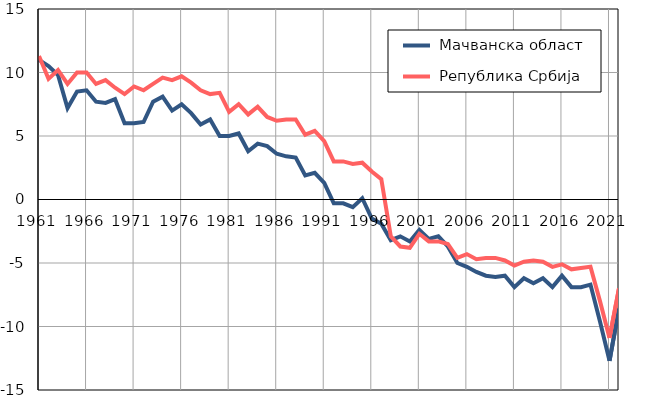
| Category |  Мачванска област |  Република Србија |
|---|---|---|
| 1961.0 | 11 | 11.3 |
| 1962.0 | 10.5 | 9.5 |
| 1963.0 | 9.8 | 10.2 |
| 1964.0 | 7.2 | 9.1 |
| 1965.0 | 8.5 | 10 |
| 1966.0 | 8.6 | 10 |
| 1967.0 | 7.7 | 9.1 |
| 1968.0 | 7.6 | 9.4 |
| 1969.0 | 7.9 | 8.8 |
| 1970.0 | 6 | 8.3 |
| 1971.0 | 6 | 8.9 |
| 1972.0 | 6.1 | 8.6 |
| 1973.0 | 7.7 | 9.1 |
| 1974.0 | 8.1 | 9.6 |
| 1975.0 | 7 | 9.4 |
| 1976.0 | 7.5 | 9.7 |
| 1977.0 | 6.8 | 9.2 |
| 1978.0 | 5.9 | 8.6 |
| 1979.0 | 6.3 | 8.3 |
| 1980.0 | 5 | 8.4 |
| 1981.0 | 5 | 6.9 |
| 1982.0 | 5.2 | 7.5 |
| 1983.0 | 3.8 | 6.7 |
| 1984.0 | 4.4 | 7.3 |
| 1985.0 | 4.2 | 6.5 |
| 1986.0 | 3.6 | 6.2 |
| 1987.0 | 3.4 | 6.3 |
| 1988.0 | 3.3 | 6.3 |
| 1989.0 | 1.9 | 5.1 |
| 1990.0 | 2.1 | 5.4 |
| 1991.0 | 1.3 | 4.6 |
| 1992.0 | -0.3 | 3 |
| 1993.0 | -0.3 | 3 |
| 1994.0 | -0.6 | 2.8 |
| 1995.0 | 0.1 | 2.9 |
| 1996.0 | -1.5 | 2.2 |
| 1997.0 | -1.9 | 1.6 |
| 1998.0 | -3.2 | -2.9 |
| 1999.0 | -2.9 | -3.7 |
| 2000.0 | -3.3 | -3.8 |
| 2001.0 | -2.4 | -2.7 |
| 2002.0 | -3.1 | -3.3 |
| 2003.0 | -2.9 | -3.3 |
| 2004.0 | -3.7 | -3.5 |
| 2005.0 | -5 | -4.6 |
| 2006.0 | -5.3 | -4.3 |
| 2007.0 | -5.7 | -4.7 |
| 2008.0 | -6 | -4.6 |
| 2009.0 | -6.1 | -4.6 |
| 2010.0 | -6 | -4.8 |
| 2011.0 | -6.9 | -5.2 |
| 2012.0 | -6.2 | -4.9 |
| 2013.0 | -6.6 | -4.8 |
| 2014.0 | -6.2 | -4.9 |
| 2015.0 | -6.9 | -5.3 |
| 2016.0 | -6 | -5.1 |
| 2017.0 | -6.9 | -5.5 |
| 2018.0 | -6.9 | -5.4 |
| 2019.0 | -6.7 | -5.3 |
| 2020.0 | -9.6 | -8 |
| 2021.0 | -12.7 | -10.9 |
| 2022.0 | -8.6 | -7 |